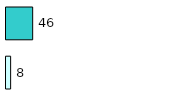
| Category | Series 0 | Series 1 |
|---|---|---|
| 0 | 8 | 46 |